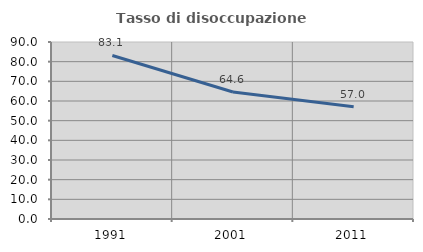
| Category | Tasso di disoccupazione giovanile  |
|---|---|
| 1991.0 | 83.149 |
| 2001.0 | 64.558 |
| 2011.0 | 57.044 |